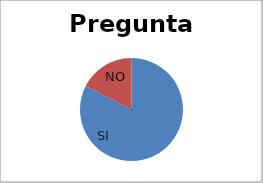
| Category | Series 0 |
|---|---|
| SI | 303 |
| NO | 64 |